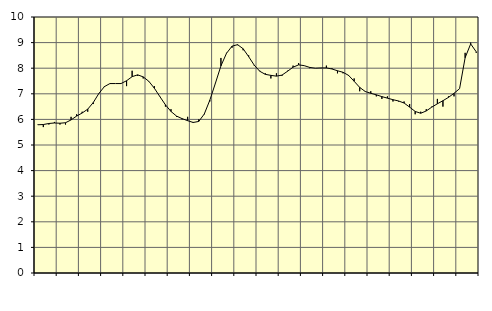
| Category | Piggar | Series 1 |
|---|---|---|
| nan | 5.8 | 5.79 |
| 1.0 | 5.7 | 5.8 |
| 1.0 | 5.8 | 5.84 |
| 1.0 | 5.9 | 5.86 |
| nan | 5.8 | 5.85 |
| 2.0 | 5.8 | 5.87 |
| 2.0 | 6.1 | 5.98 |
| 2.0 | 6.2 | 6.13 |
| nan | 6.3 | 6.25 |
| 3.0 | 6.3 | 6.4 |
| 3.0 | 6.6 | 6.66 |
| 3.0 | 7 | 7.01 |
| nan | 7.3 | 7.28 |
| 4.0 | 7.4 | 7.4 |
| 4.0 | 7.4 | 7.4 |
| 4.0 | 7.4 | 7.4 |
| nan | 7.3 | 7.51 |
| 5.0 | 7.9 | 7.67 |
| 5.0 | 7.7 | 7.74 |
| 5.0 | 7.6 | 7.66 |
| nan | 7.5 | 7.49 |
| 6.0 | 7.3 | 7.22 |
| 6.0 | 6.9 | 6.89 |
| 6.0 | 6.5 | 6.57 |
| nan | 6.4 | 6.31 |
| 7.0 | 6.1 | 6.13 |
| 7.0 | 6 | 6.03 |
| 7.0 | 6.1 | 5.95 |
| nan | 5.9 | 5.88 |
| 8.0 | 6 | 5.92 |
| 8.0 | 6.2 | 6.21 |
| 8.0 | 6.7 | 6.75 |
| nan | 7.4 | 7.41 |
| 9.0 | 8.4 | 8.09 |
| 9.0 | 8.6 | 8.58 |
| 9.0 | 8.8 | 8.86 |
| nan | 8.9 | 8.92 |
| 10.0 | 8.7 | 8.76 |
| 10.0 | 8.5 | 8.45 |
| 10.0 | 8.1 | 8.12 |
| nan | 7.9 | 7.88 |
| 11.0 | 7.8 | 7.76 |
| 11.0 | 7.6 | 7.72 |
| 11.0 | 7.8 | 7.69 |
| nan | 7.7 | 7.73 |
| 12.0 | 7.9 | 7.88 |
| 12.0 | 8.1 | 8.04 |
| 12.0 | 8.2 | 8.13 |
| nan | 8.1 | 8.1 |
| 13.0 | 8 | 8.03 |
| 13.0 | 8 | 8 |
| 13.0 | 8 | 8.01 |
| nan | 8.1 | 8.01 |
| 14.0 | 8 | 7.97 |
| 14.0 | 7.8 | 7.9 |
| 14.0 | 7.8 | 7.84 |
| nan | 7.7 | 7.72 |
| 15.0 | 7.6 | 7.49 |
| 15.0 | 7.1 | 7.25 |
| 15.0 | 7.1 | 7.09 |
| nan | 7.1 | 7.02 |
| 16.0 | 6.9 | 6.96 |
| 16.0 | 6.8 | 6.89 |
| 16.0 | 6.9 | 6.83 |
| nan | 6.7 | 6.77 |
| 17.0 | 6.7 | 6.72 |
| 17.0 | 6.7 | 6.64 |
| 17.0 | 6.6 | 6.48 |
| nan | 6.2 | 6.31 |
| 18.0 | 6.3 | 6.24 |
| 18.0 | 6.4 | 6.33 |
| 18.0 | 6.5 | 6.48 |
| nan | 6.8 | 6.61 |
| 19.0 | 6.5 | 6.73 |
| 19.0 | 6.9 | 6.86 |
| 19.0 | 6.9 | 7.02 |
| nan | 7.2 | 7.2 |
| 20.0 | 8.6 | 8.41 |
| 20.0 | 9 | 8.95 |
| 20.0 | 8.6 | 8.64 |